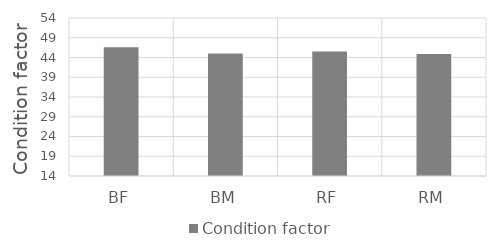
| Category | Condition factor |
|---|---|
| BF | 46.6 |
| BM | 45 |
| RF | 45.5 |
| RM | 44.9 |